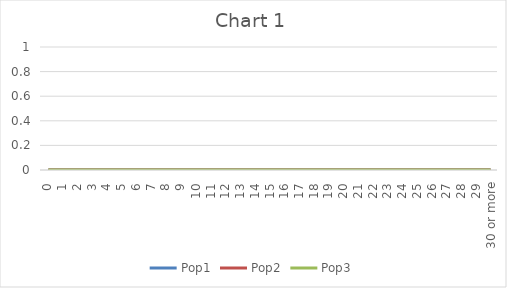
| Category | Pop1 | Pop2 | Pop3 |
|---|---|---|---|
| 0 | 0 | 0 | 0 |
| 1 | 0 | 0 | 0 |
| 2 | 0 | 0 | 0 |
| 3 | 0 | 0 | 0 |
| 4 | 0 | 0 | 0 |
| 5 | 0 | 0 | 0 |
| 6 | 0 | 0 | 0 |
| 7 | 0 | 0 | 0 |
| 8 | 0 | 0 | 0 |
| 9 | 0 | 0 | 0 |
| 10 | 0 | 0 | 0 |
| 11 | 0 | 0 | 0 |
| 12 | 0 | 0 | 0 |
| 13 | 0 | 0 | 0 |
| 14 | 0 | 0 | 0 |
| 15 | 0 | 0 | 0 |
| 16 | 0 | 0 | 0 |
| 17 | 0 | 0 | 0 |
| 18 | 0 | 0 | 0 |
| 19 | 0 | 0 | 0 |
| 20 | 0 | 0 | 0 |
| 21 | 0 | 0 | 0 |
| 22 | 0 | 0 | 0 |
| 23 | 0 | 0 | 0 |
| 24 | 0 | 0 | 0 |
| 25 | 0 | 0 | 0 |
| 26 | 0 | 0 | 0 |
| 27 | 0 | 0 | 0 |
| 28 | 0 | 0 | 0 |
| 29 | 0 | 0 | 0 |
| 30 or more | 0 | 0 | 0 |